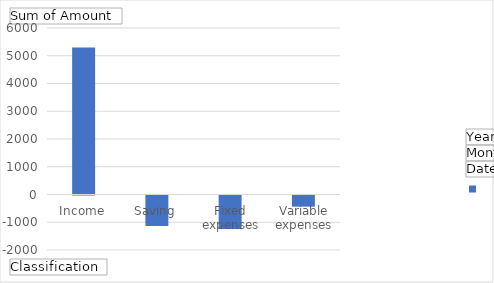
| Category | 2022 - May |
|---|---|
| Income | 5300 |
| Saving | -1100 |
| Fixed expenses | -1210.23 |
| Variable expenses | -401.73 |